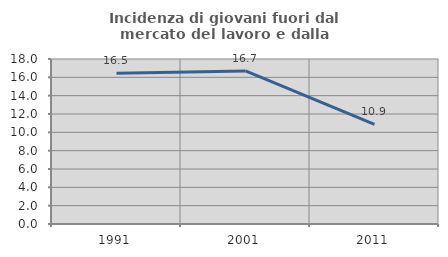
| Category | Incidenza di giovani fuori dal mercato del lavoro e dalla formazione  |
|---|---|
| 1991.0 | 16.452 |
| 2001.0 | 16.694 |
| 2011.0 | 10.874 |